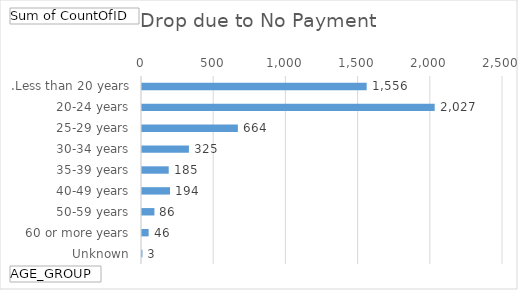
| Category | Total |
|---|---|
| .Less than 20 years | 1556 |
| 20-24 years | 2027 |
| 25-29 years | 664 |
| 30-34 years | 325 |
| 35-39 years | 185 |
| 40-49 years | 194 |
| 50-59 years | 86 |
| 60 or more years | 46 |
| Unknown | 3 |